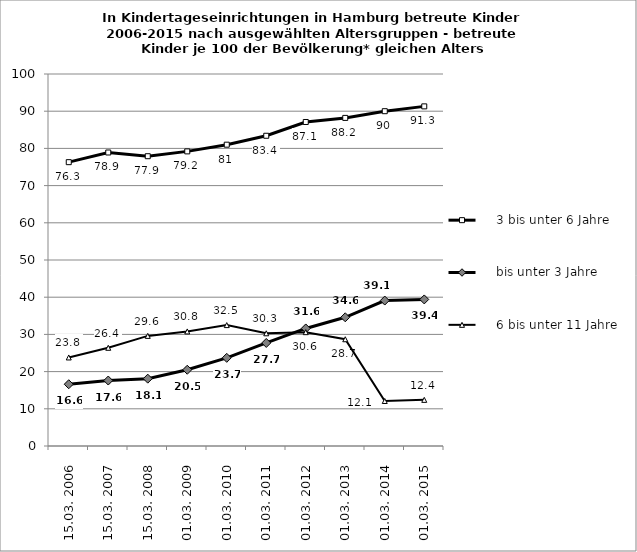
| Category |     3 bis unter 6 Jahre |     bis unter 3 Jahre |     6 bis unter 11 Jahre |
|---|---|---|---|
| 15.03. 2006 | 76.3 | 16.6 | 23.8 |
| 15.03. 2007 | 78.9 | 17.6 | 26.4 |
| 15.03. 2008 | 77.9 | 18.1 | 29.6 |
| 01.03. 2009 | 79.2 | 20.5 | 30.8 |
| 01.03. 2010 | 81 | 23.7 | 32.5 |
| 01.03. 2011 | 83.4 | 27.7 | 30.3 |
| 01.03. 2012 | 87.1 | 31.6 | 30.6 |
| 01.03. 2013 | 88.2 | 34.6 | 28.7 |
| 01.03. 2014 | 90 | 39.1 | 12.1 |
| 01.03. 2015 | 91.3 | 39.4 | 12.4 |